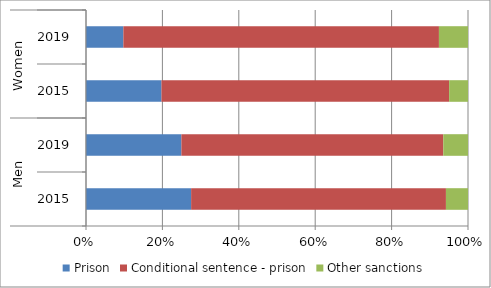
| Category | Prison | Conditional sentence - prison | Other sanctions |
|---|---|---|---|
| 0 | 27.519 | 66.706 | 5.775 |
| 1 | 24.969 | 68.563 | 6.467 |
| 2 | 19.753 | 75.309 | 4.938 |
| 3 | 9.783 | 82.609 | 7.609 |